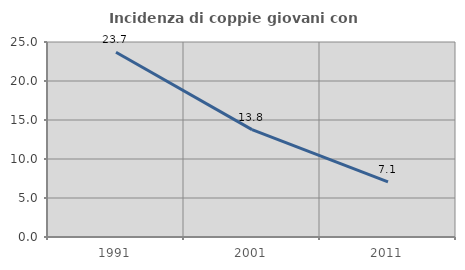
| Category | Incidenza di coppie giovani con figli |
|---|---|
| 1991.0 | 23.684 |
| 2001.0 | 13.772 |
| 2011.0 | 7.078 |